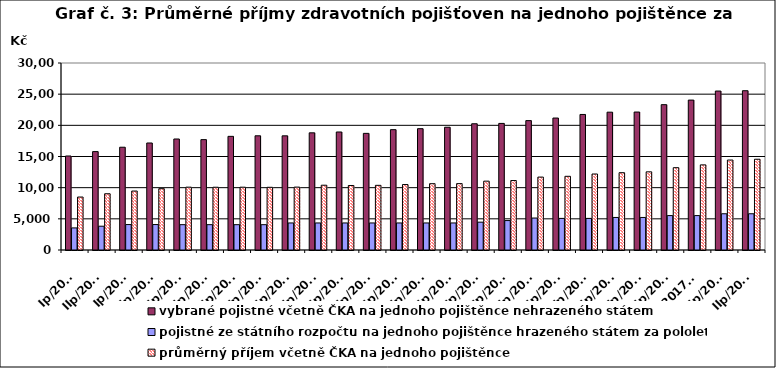
| Category | vybrané pojistné včetně ČKA na jednoho pojištěnce nehrazeného státem  | pojistné ze státního rozpočtu na jednoho pojištěnce hrazeného státem za pololetí  | průměrný příjem včetně ČKA na jednoho pojištěnce |
|---|---|---|---|
| Ip/2006 | 15082.257 | 3542.593 | 8495.722 |
| IIp/2006 | 15785.985 | 3817.035 | 9024.675 |
| Ip/2007 | 16488.212 | 4081.447 | 9459.526 |
| IIp/2007 | 17166.135 | 4082.352 | 9836.083 |
| Ip/2008 | 17808.151 | 4064.534 | 10081.559 |
| IIp/2008 | 17704.942 | 4064.288 | 10069.078 |
| Ip/2009 | 18232.683 | 4063.072 | 10074.667 |
| IIp/2009 | 18321.893 | 4062.915 | 10057.406 |
| Ip/2010 | 18316.395 | 4338.634 | 10089.544 |
| IIp/2010 | 18798.341 | 4338.533 | 10393.495 |
| Ip/2011 | 18931.802 | 4338.662 | 10348.648 |
| IIp/2011 | 18711.05 | 4338.663 | 10374.592 |
| Ip/2012 | 19304.352 | 4339.03 | 10502.618 |
| IIp/2012 | 19463.128 | 4338.186 | 10637.262 |
| Ip/2013 | 19693.633 | 4338.024 | 10650.373 |
| Ip/2013 | 20253.156 | 4465.678 | 11046.225 |
| Ip/2014 | 20309.098 | 4722.015 | 11143.067 |
| IIp/2014 | 20755.41 | 5128.5 | 11697.748 |
| Ip/2015 | 21171.193 | 5070.005 | 11823.721 |
| IIp/2015 | 21743.057 | 5070 | 12191.59 |
| Ip/2016 | 22111.163 | 5220 | 12401.46 |
| IIp/2016 | 22131.662 | 5220 | 12540.463 |
| Ip/2017 | 23315.23 | 5520 | 13206.67 |
| IIp/2017 *) | 24050.41 | 5520 | 13655.028 |
| Ip/2018 | 25500.62 | 5814 | 14432.484 |
| IIp/2018 | 25553.728 | 5814 | 14558.839 |